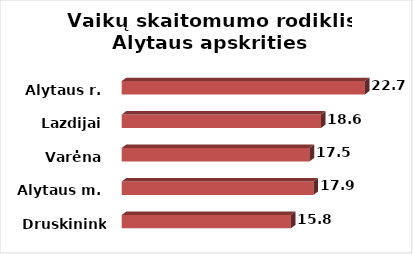
| Category | Series 0 |
|---|---|
| Druskininkai | 15.766 |
| Alytaus m. | 17.882 |
| Varėna | 17.516 |
| Lazdijai | 18.582 |
| Alytaus r. | 22.669 |